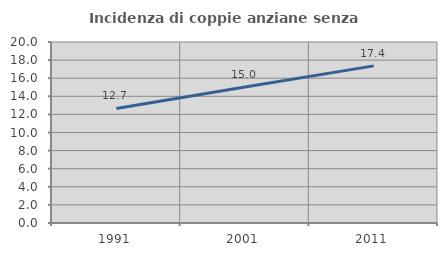
| Category | Incidenza di coppie anziane senza figli  |
|---|---|
| 1991.0 | 12.661 |
| 2001.0 | 15.038 |
| 2011.0 | 17.363 |